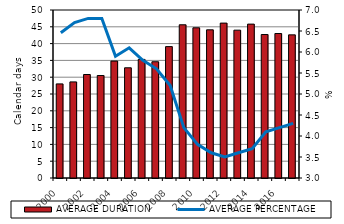
| Category | AVERAGE DURATION |
|---|---|
| 2000.0 | 28 |
| 2001.0 | 28.6 |
| 2002.0 | 30.8 |
| 2003.0 | 30.5 |
| 2004.0 | 34.8 |
| 2005.0 | 32.8 |
| 2006.0 | 35.3 |
| 2007.0 | 34.6 |
| 2008.0 | 39.1 |
| 2009.0 | 45.6 |
| 2010.0 | 44.7 |
| 2011.0 | 44.1 |
| 2012.0 | 46.1 |
| 2013.0 | 44 |
| 2014.0 | 45.8 |
| 2015.0 | 42.7 |
| 2016.0 | 43 |
| 2017.0 | 42.6 |